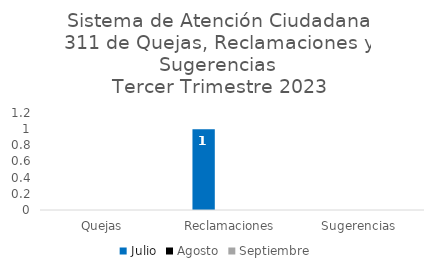
| Category | Julio | Agosto | Septiembre |
|---|---|---|---|
| Quejas | 0 | 0 | 0 |
| Reclamaciones | 1 | 0 | 0 |
| Sugerencias | 0 | 0 | 0 |